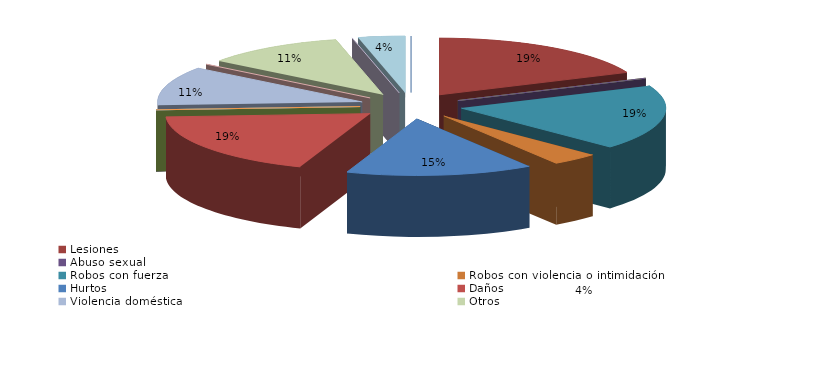
| Category | Series 0 |
|---|---|
| Homicidio/Asesinato dolosos | 0 |
| Lesiones | 5 |
| Agresión sexual | 0 |
| Abuso sexual | 0 |
| Robos con fuerza | 5 |
| Robos con violencia o intimidación | 1 |
| Hurtos | 4 |
| Daños | 5 |
| Contra la salud pública | 0 |
| Conduccción etílica/drogas | 0 |
| Conducción temeraria | 0 |
| Conducción sin permiso | 0 |
| Violencia doméstica | 3 |
| Violencia de género | 0 |
| Otros | 3 |
| Atentados y delitos de resistencia y desobediencia grave | 0 |
| Otros delitos contra el orden público | 1 |